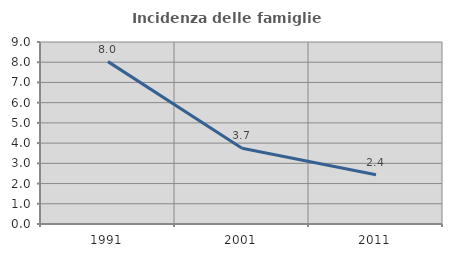
| Category | Incidenza delle famiglie numerose |
|---|---|
| 1991.0 | 8.029 |
| 2001.0 | 3.742 |
| 2011.0 | 2.433 |